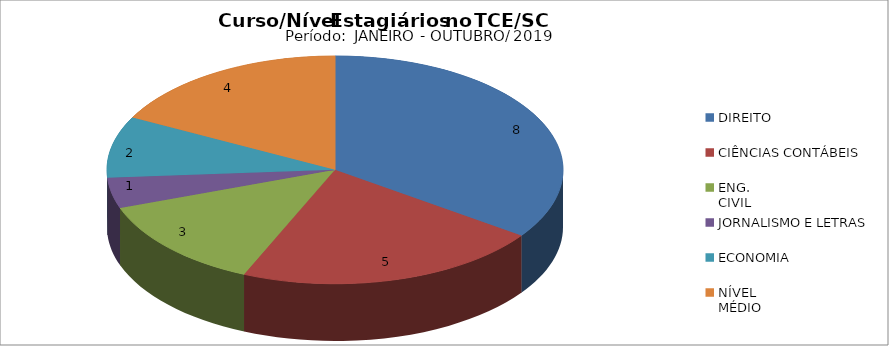
| Category | Series 0 |
|---|---|
| DIREITO | 8 |
| CIÊNCIAS CONTÁBEIS | 5 |
| ENG.
CIVIL | 3 |
| JORNALISMO E LETRAS | 1 |
| ECONOMIA | 2 |
| NÍVEL
MÉDIO  | 4 |